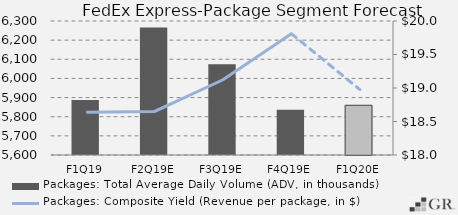
| Category | Packages: Total Average Daily Volume (ADV, in thousands) |
|---|---|
|  F1Q19  | 5886.7 |
|  F2Q19E  | 6265.68 |
|  F3Q19E  | 6074.597 |
|  F4Q19E  | 5836.306 |
|  F1Q20E  | 5859.815 |